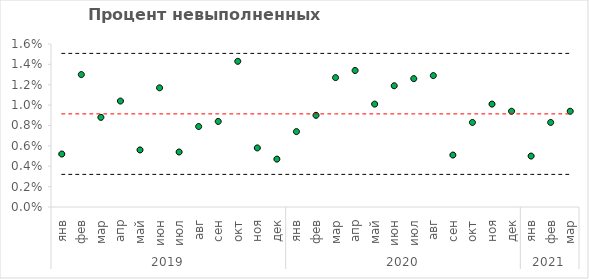
| Category | Процент невыполненных заказов | Нижняя граница | X̅ | Верхняя граница |
|---|---|---|---|---|
| 0 | 0.005 | 0.003 | 0.009 | 0.015 |
| 1 | 0.013 | 0.003 | 0.009 | 0.015 |
| 2 | 0.009 | 0.003 | 0.009 | 0.015 |
| 3 | 0.01 | 0.003 | 0.009 | 0.015 |
| 4 | 0.006 | 0.003 | 0.009 | 0.015 |
| 5 | 0.012 | 0.003 | 0.009 | 0.015 |
| 6 | 0.005 | 0.003 | 0.009 | 0.015 |
| 7 | 0.008 | 0.003 | 0.009 | 0.015 |
| 8 | 0.008 | 0.003 | 0.009 | 0.015 |
| 9 | 0.014 | 0.003 | 0.009 | 0.015 |
| 10 | 0.006 | 0.003 | 0.009 | 0.015 |
| 11 | 0.005 | 0.003 | 0.009 | 0.015 |
| 12 | 0.007 | 0.003 | 0.009 | 0.015 |
| 13 | 0.009 | 0.003 | 0.009 | 0.015 |
| 14 | 0.013 | 0.003 | 0.009 | 0.015 |
| 15 | 0.013 | 0.003 | 0.009 | 0.015 |
| 16 | 0.01 | 0.003 | 0.009 | 0.015 |
| 17 | 0.012 | 0.003 | 0.009 | 0.015 |
| 18 | 0.013 | 0.003 | 0.009 | 0.015 |
| 19 | 0.013 | 0.003 | 0.009 | 0.015 |
| 20 | 0.005 | 0.003 | 0.009 | 0.015 |
| 21 | 0.008 | 0.003 | 0.009 | 0.015 |
| 22 | 0.01 | 0.003 | 0.009 | 0.015 |
| 23 | 0.009 | 0.003 | 0.009 | 0.015 |
| 24 | 0.005 | 0.003 | 0.009 | 0.015 |
| 25 | 0.008 | 0.003 | 0.009 | 0.015 |
| 26 | 0.009 | 0.003 | 0.009 | 0.015 |